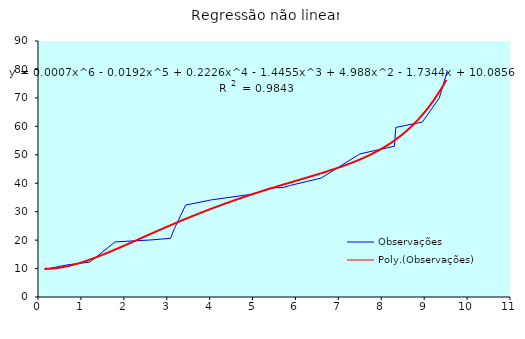
| Category | Observações |
|---|---|
| 0.15 | 9.685 |
| 0.696 | 11.329 |
| 1.205 | 12.259 |
| 1.797 | 19.376 |
| 2.615 | 20.042 |
| 3.088 | 20.625 |
| 3.178 | 24.032 |
| 3.44 | 32.302 |
| 4.025 | 34.108 |
| 4.996 | 36.158 |
| 5.427 | 38.358 |
| 5.711 | 38.468 |
| 5.867 | 39.193 |
| 6.6 | 41.818 |
| 7.499 | 50.303 |
| 8.307 | 53.007 |
| 8.339 | 59.615 |
| 8.957 | 61.515 |
| 9.352 | 69.982 |
| 9.532 | 79.132 |